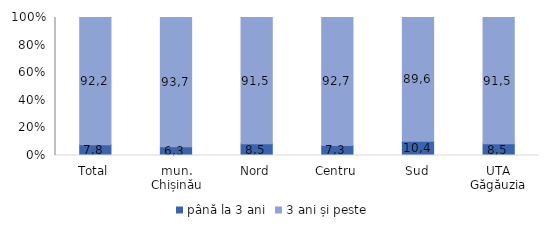
| Category | până la 3 ani | 3 ani și peste |
|---|---|---|
| Total | 7.8 | 92.2 |
| mun. Chișinău | 6.3 | 93.7 |
| Nord | 8.5 | 91.5 |
| Centru | 7.3 | 92.7 |
| Sud | 10.4 | 89.6 |
| UTA Găgăuzia | 8.5 | 91.5 |